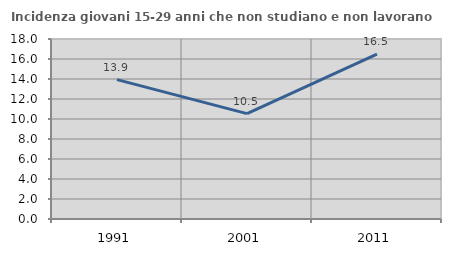
| Category | Incidenza giovani 15-29 anni che non studiano e non lavorano  |
|---|---|
| 1991.0 | 13.939 |
| 2001.0 | 10.534 |
| 2011.0 | 16.495 |